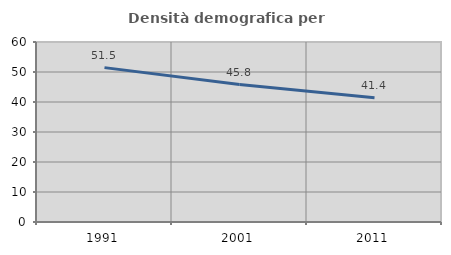
| Category | Densità demografica |
|---|---|
| 1991.0 | 51.461 |
| 2001.0 | 45.817 |
| 2011.0 | 41.393 |